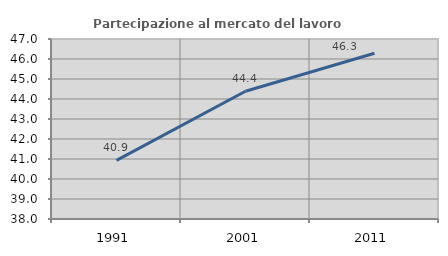
| Category | Partecipazione al mercato del lavoro  femminile |
|---|---|
| 1991.0 | 40.933 |
| 2001.0 | 44.385 |
| 2011.0 | 46.286 |